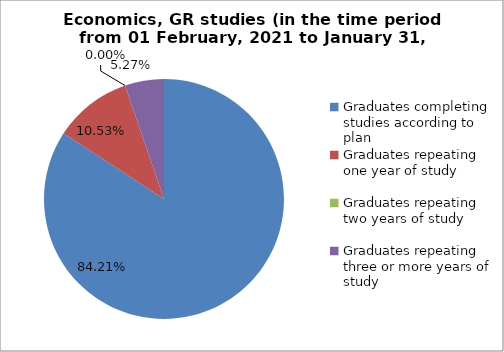
| Category | Series 0 |
|---|---|
| Graduates completing studies according to plan | 84.211 |
| Graduates repeating one year of study | 10.526 |
| Graduates repeating two years of study | 0 |
| Graduates repeating three or more years of study | 5.263 |